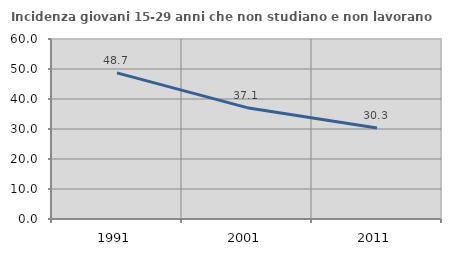
| Category | Incidenza giovani 15-29 anni che non studiano e non lavorano  |
|---|---|
| 1991.0 | 48.695 |
| 2001.0 | 37.117 |
| 2011.0 | 30.318 |